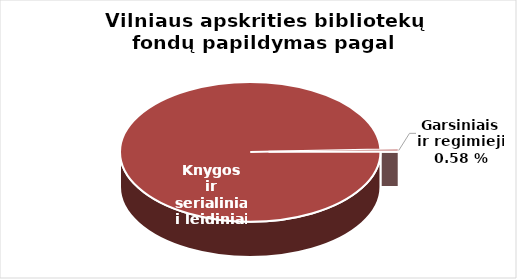
| Category | Series 0 |
|---|---|
| Knygos ir  | 98105 |
| Garsiniai ir regimieji | 569 |